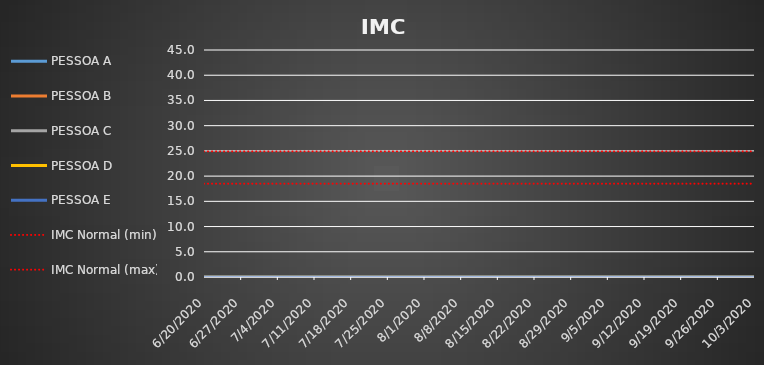
| Category | PESSOA A | PESSOA B | PESSOA C | PESSOA D | PESSOA E | IMC Normal (min) | IMC Normal (max) |
|---|---|---|---|---|---|---|---|
| 6/20/20 | 0 | 0 | 0 | 0 | 0 | 18.5 | 24.9 |
| 6/27/20 | 0 | 0 | 0 | 0 | 0 | 18.5 | 24.9 |
| 7/4/20 | 0 | 0 | 0 | 0 | 0 | 18.5 | 24.9 |
| 7/11/20 | 0 | 0 | 0 | 0 | 0 | 18.5 | 24.9 |
| 7/18/20 | 0 | 0 | 0 | 0 | 0 | 18.5 | 24.9 |
| 7/25/20 | 0 | 0 | 0 | 0 | 0 | 18.5 | 24.9 |
| 8/1/20 | 0 | 0 | 0 | 0 | 0 | 18.5 | 24.9 |
| 8/8/20 | 0 | 0 | 0 | 0 | 0 | 18.5 | 24.9 |
| 8/15/20 | 0 | 0 | 0 | 0 | 0 | 18.5 | 24.9 |
| 8/22/20 | 0 | 0 | 0 | 0 | 0 | 18.5 | 24.9 |
| 8/29/20 | 0 | 0 | 0 | 0 | 0 | 18.5 | 24.9 |
| 9/5/20 | 0 | 0 | 0 | 0 | 0 | 18.5 | 24.9 |
| 9/12/20 | 0 | 0 | 0 | 0 | 0 | 18.5 | 24.9 |
| 9/19/20 | 0 | 0 | 0 | 0 | 0 | 18.5 | 24.9 |
| 9/26/20 | 0 | 0 | 0 | 0 | 0 | 18.5 | 24.9 |
| 10/3/20 | 0 | 0 | 0 | 0 | 0 | 18.5 | 24.9 |